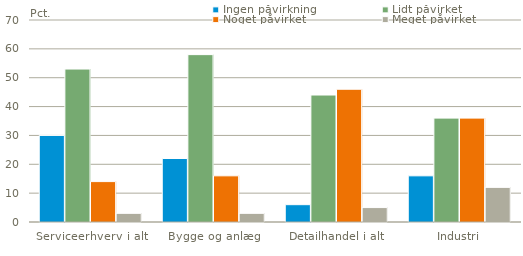
| Category | Ingen påvirkning | Lidt påvirket | Noget påvirket | Meget påvirket |
|---|---|---|---|---|
| Serviceerhverv i alt | 30 | 53 | 14 | 3 |
| Bygge og anlæg | 22 | 58 | 16 | 3 |
| Detailhandel i alt | 6 | 44 | 46 | 5 |
| Industri | 16 | 36 | 36 | 12 |